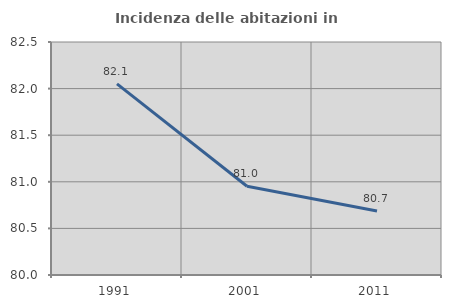
| Category | Incidenza delle abitazioni in proprietà  |
|---|---|
| 1991.0 | 82.051 |
| 2001.0 | 80.952 |
| 2011.0 | 80.687 |